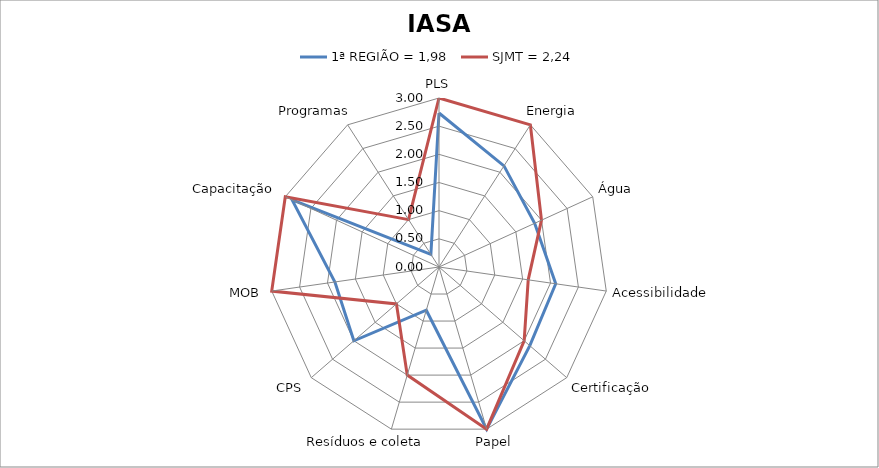
| Category | 1ª REGIÃO = 1,98 | SJMT = 2,24 |
|---|---|---|
| PLS | 2.733 | 3 |
| Energia | 2.133 | 3 |
| Água | 1.867 | 2 |
| Acessibilidade | 2.093 | 1.6 |
| Certificação | 2.133 | 2 |
| Papel | 3 | 3 |
| Resíduos e coleta | 0.8 | 2 |
| CPS | 2 | 1 |
| MOB | 1.867 | 3 |
| Capacitação | 2.867 | 3 |
| Programas | 0.267 | 1 |